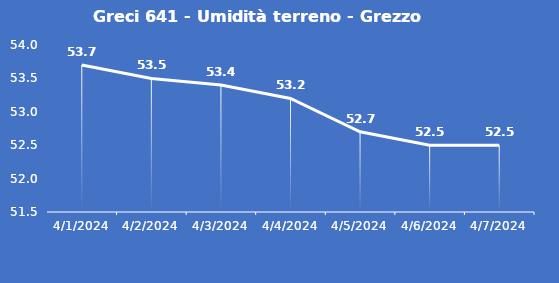
| Category | Greci 641 - Umidità terreno - Grezzo (%VWC) |
|---|---|
| 4/1/24 | 53.7 |
| 4/2/24 | 53.5 |
| 4/3/24 | 53.4 |
| 4/4/24 | 53.2 |
| 4/5/24 | 52.7 |
| 4/6/24 | 52.5 |
| 4/7/24 | 52.5 |